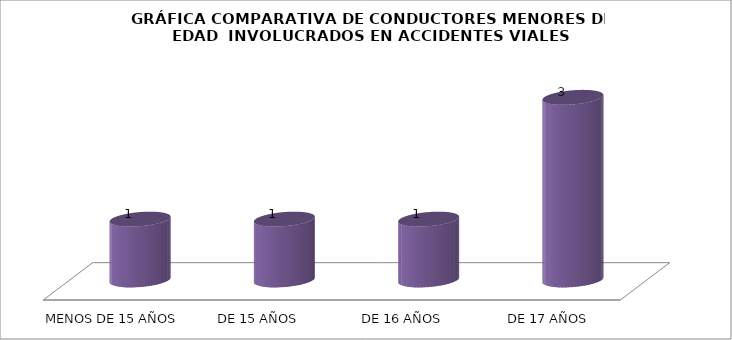
| Category | Series 0 |
|---|---|
| MENOS DE 15 AÑOS | 1 |
| DE 15 AÑOS | 1 |
| DE 16 AÑOS | 1 |
|  DE 17 AÑOS | 3 |